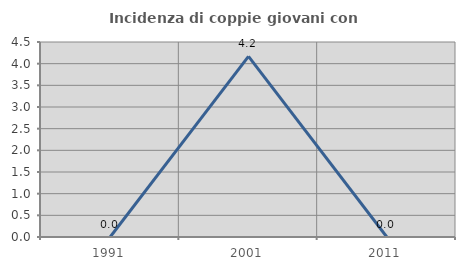
| Category | Incidenza di coppie giovani con figli |
|---|---|
| 1991.0 | 0 |
| 2001.0 | 4.167 |
| 2011.0 | 0 |